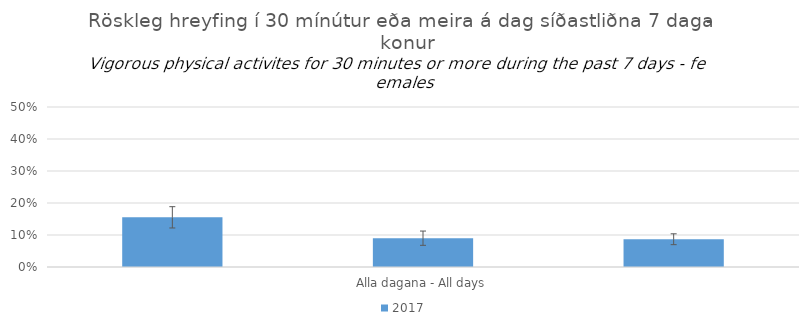
| Category | 2017 |
|---|---|
| 0 | 0.155 |
| 1 | 0.09 |
| 2 | 0.087 |